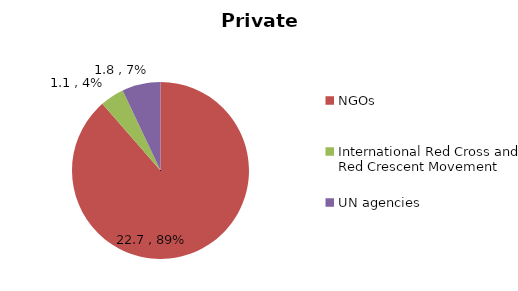
| Category | Private |
|---|---|
| NGOs | 22.731 |
| International Red Cross and Red Crescent Movement | 1.124 |
| UN agencies | 1.804 |